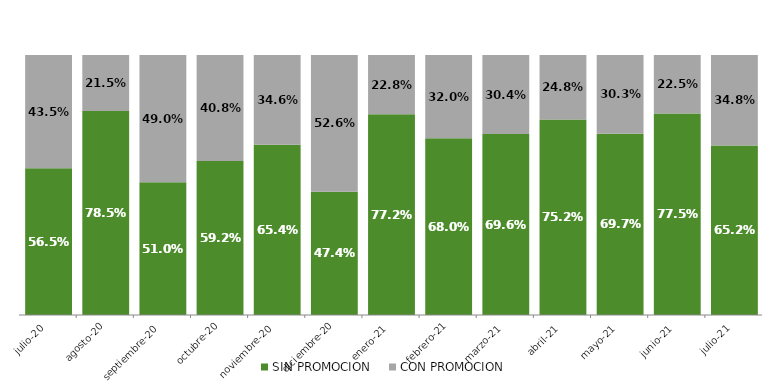
| Category | SIN PROMOCION   | CON PROMOCION   |
|---|---|---|
| 2020-07-01 | 0.565 | 0.435 |
| 2020-08-01 | 0.785 | 0.215 |
| 2020-09-01 | 0.51 | 0.49 |
| 2020-10-01 | 0.592 | 0.408 |
| 2020-11-01 | 0.654 | 0.346 |
| 2020-12-01 | 0.474 | 0.526 |
| 2021-01-01 | 0.772 | 0.228 |
| 2021-02-01 | 0.68 | 0.32 |
| 2021-03-01 | 0.696 | 0.304 |
| 2021-04-01 | 0.752 | 0.248 |
| 2021-05-01 | 0.697 | 0.303 |
| 2021-06-01 | 0.775 | 0.225 |
| 2021-07-01 | 0.652 | 0.348 |